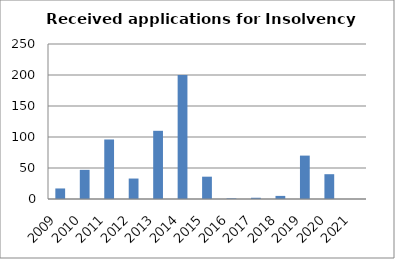
| Category | Series 0 |
|---|---|
| 2009.0 | 17 |
| 2010.0 | 47 |
| 2011.0 | 96 |
| 2012.0 | 33 |
| 2013.0 | 110 |
| 2014.0 | 200 |
| 2015.0 | 36 |
| 2016.0 | 1 |
| 2017.0 | 2 |
| 2018.0 | 5 |
| 2019.0 | 70 |
| 2020.0 | 40 |
| 2021.0 | 0 |